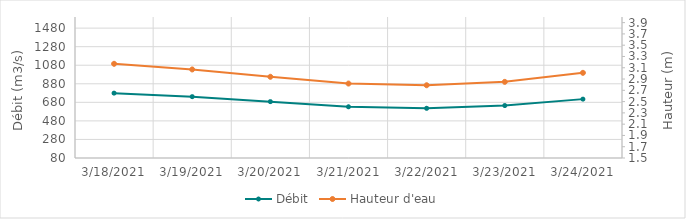
| Category | Débit |
|---|---|
| 2/18/21 | 580.92 |
| 2/17/21 | 647.89 |
| 2/16/21 | 736.23 |
| 2/15/21 | 815.31 |
| 2/14/21 | 893.25 |
| 2/13/21 | 941.5 |
| 2/12/21 | 970.2 |